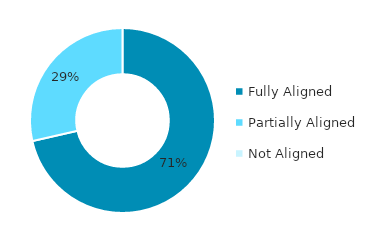
| Category | Series 0 |
|---|---|
| Fully Aligned | 0.714 |
| Partially Aligned | 0.286 |
| Not Aligned | 0 |